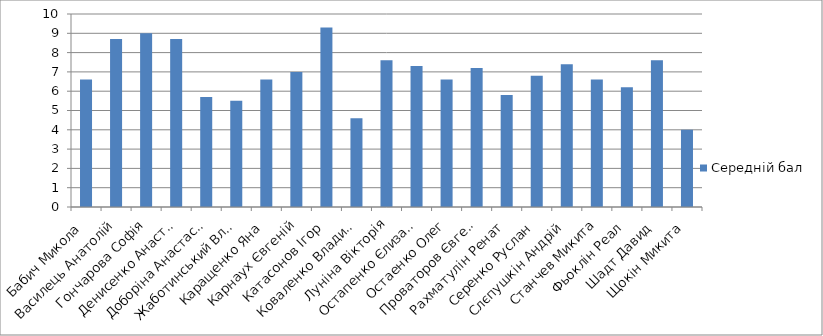
| Category | Середній бал |
|---|---|
| Бабич Микола | 6.6 |
| Василець Анатолій | 8.7 |
| Гончарова Софія | 9 |
| Денисенко Анастасія | 8.7 |
| Доборіна Анастасія | 5.7 |
| Жаботинський Владислав | 5.5 |
| Каращенко Яна | 6.6 |
| Карнаух Євгеній | 7 |
| Катасонов Ігор | 9.3 |
| Коваленко Владислав | 4.6 |
| Луніна Вікторія | 7.6 |
| Остапенко Єлизавета | 7.3 |
| Остаенко Олег | 6.6 |
| Проваторов Євгеній | 7.2 |
| Рахматулін Ренат | 5.8 |
| Серенко Руслан | 6.8 |
| Слєпушкін Андрій | 7.4 |
| Станчев Микита | 6.6 |
| Фьоклін Реал | 6.2 |
| Шадт Давид | 7.6 |
| Щокін Микита | 4 |